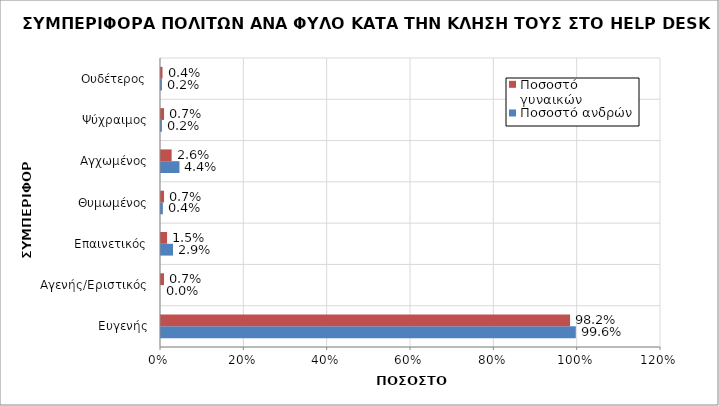
| Category | Ποσοστό ανδρών | Ποσοστό γυναικών |
|---|---|---|
| Ευγενής | 0.996 | 0.982 |
| Αγενής/Εριστικός | 0 | 0.007 |
| Επαινετικός | 0.029 | 0.015 |
| Θυμωμένος | 0.004 | 0.007 |
| Αγχωμένος | 0.044 | 0.026 |
| Ψύχραιμος | 0.002 | 0.007 |
| Ουδέτερος | 0.002 | 0.004 |